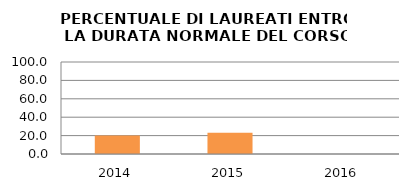
| Category | 2014 2015 2016 |
|---|---|
| 2014.0 | 20 |
| 2015.0 | 23.077 |
| 2016.0 | 0 |